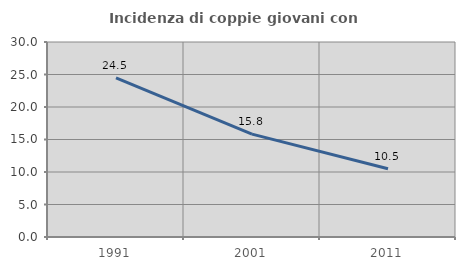
| Category | Incidenza di coppie giovani con figli |
|---|---|
| 1991.0 | 24.475 |
| 2001.0 | 15.824 |
| 2011.0 | 10.501 |